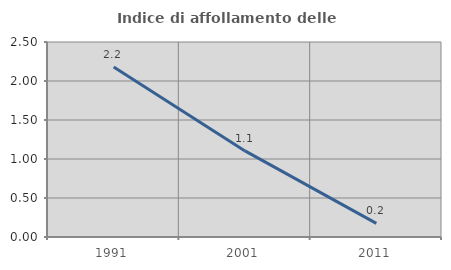
| Category | Indice di affollamento delle abitazioni  |
|---|---|
| 1991.0 | 2.178 |
| 2001.0 | 1.104 |
| 2011.0 | 0.175 |